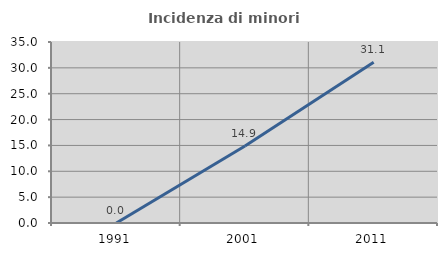
| Category | Incidenza di minori stranieri |
|---|---|
| 1991.0 | 0 |
| 2001.0 | 14.894 |
| 2011.0 | 31.088 |